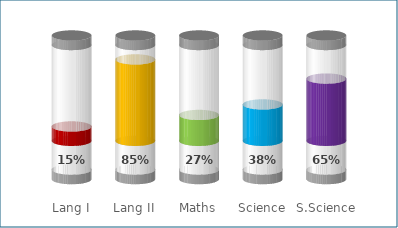
| Category | Bottom | Label | Marks | Percent | Top |
|---|---|---|---|---|---|
| Lang I | 0.1 | 0.3 | 0.15 | 0.85 | 0.1 |
| Lang II | 0.1 | 0.3 | 0.85 | 0.15 | 0.1 |
| Maths | 0.1 | 0.3 | 0.27 | 0.73 | 0.1 |
| Science | 0.1 | 0.3 | 0.38 | 0.62 | 0.1 |
| S.Science | 0.1 | 0.3 | 0.65 | 0.35 | 0.1 |